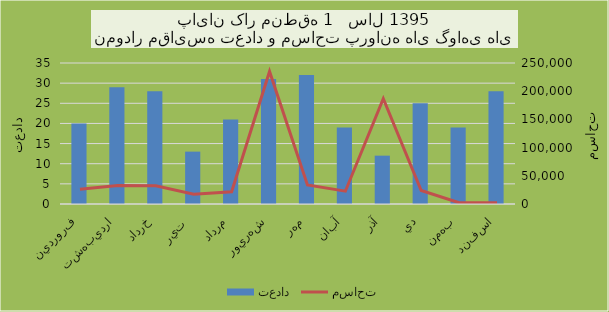
| Category | تعداد |
|---|---|
| فروردين | 20 |
| ارديبهشت | 29 |
| خرداد | 28 |
| تير  | 13 |
| مرداد | 21 |
| شهريور | 31 |
| مهر | 32 |
| آبان | 19 |
| آذر | 12 |
| دي | 25 |
| بهمن | 19 |
| اسفند | 28 |